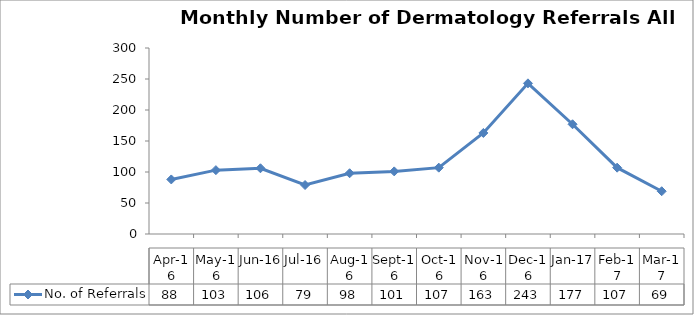
| Category | No. of Referrals |
|---|---|
| 2016-04-01 | 88 |
| 2016-05-01 | 103 |
| 2016-06-01 | 106 |
| 2016-07-01 | 79 |
| 2016-08-01 | 98 |
| 2016-09-01 | 101 |
| 2016-10-01 | 107 |
| 2016-11-01 | 163 |
| 2016-12-01 | 243 |
| 2017-01-01 | 177 |
| 2017-02-01 | 107 |
| 2017-03-01 | 69 |